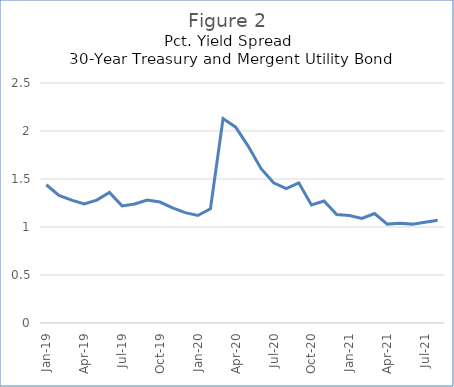
| Category | Series 0 |
|---|---|
| 2019-01-01 | 1.44 |
| 2019-02-01 | 1.33 |
| 2019-03-01 | 1.28 |
| 2019-04-01 | 1.24 |
| 2019-05-01 | 1.28 |
| 2019-06-01 | 1.36 |
| 2019-07-01 | 1.22 |
| 2019-08-01 | 1.24 |
| 2019-09-01 | 1.28 |
| 2019-10-01 | 1.26 |
| 2019-11-01 | 1.2 |
| 2019-12-01 | 1.15 |
| 2020-01-01 | 1.12 |
| 2020-02-01 | 1.19 |
| 2020-03-01 | 2.13 |
| 2020-04-01 | 2.04 |
| 2020-05-01 | 1.84 |
| 2020-06-01 | 1.61 |
| 2020-07-01 | 1.46 |
| 2020-08-01 | 1.4 |
| 2020-09-01 | 1.46 |
| 2020-10-01 | 1.23 |
| 2020-11-01 | 1.27 |
| 2020-12-01 | 1.13 |
| 2021-01-01 | 1.12 |
| 2021-02-01 | 1.09 |
| 2021-03-01 | 1.14 |
| 2021-04-01 | 1.03 |
| 2021-05-01 | 1.04 |
| 2021-06-01 | 1.03 |
| 2021-07-01 | 1.05 |
| 2021-08-01 | 1.07 |